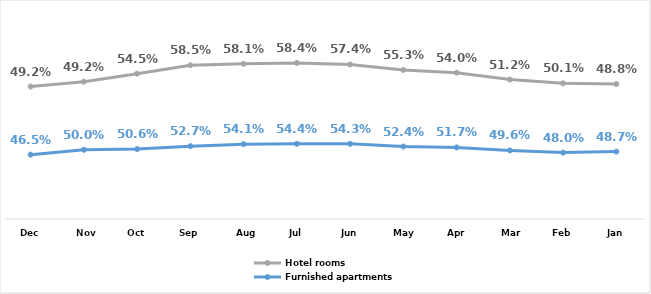
| Category | Furnished apartments | Hotel rooms |
|---|---|---|
| Jan | 0.487 | 0.488 |
| Feb | 0.48 | 0.501 |
| Mar | 0.496 | 0.512 |
| Apr | 0.517 | 0.54 |
| May | 0.524 | 0.553 |
| Jun | 0.543 | 0.574 |
| Jul | 0.544 | 0.584 |
| Aug | 0.541 | 0.581 |
| Sep | 0.527 | 0.585 |
| Oct | 0.506 | 0.545 |
| Nov | 0.5 | 0.492 |
| Dec | 0.465 | 0.492 |